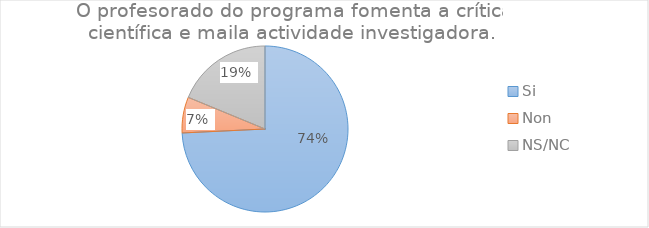
| Category | Series 0 |
|---|---|
| Si | 170 |
| Non | 16 |
| NS/NC | 43 |